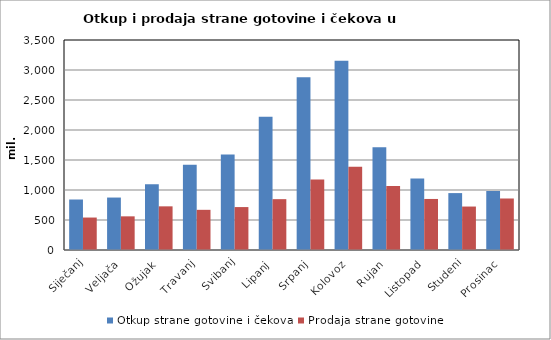
| Category | Otkup strane gotovine i čekova  | Prodaja strane gotovine  |
|---|---|---|
| Siječanj | 841588049 | 541030108 |
| Veljača | 874219978 | 561029169 |
| Ožujak | 1095569624 | 727658897 |
| Travanj | 1419430407 | 669577748 |
| Svibanj | 1590976507 | 715469391 |
| Lipanj | 2220761173 | 847398673 |
| Srpanj | 2879356607 | 1176378534 |
| Kolovoz | 3152443991 | 1389032922 |
| Rujan | 1710837480 | 1066901621 |
| Listopad | 1189684405 | 850648937 |
| Studeni | 948384340 | 724286943 |
| Prosinac | 983045136 | 858464241 |